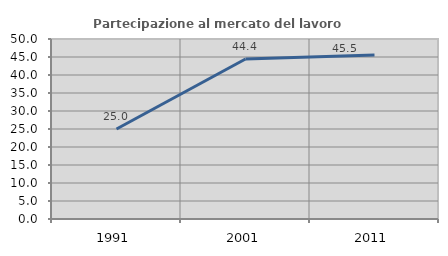
| Category | Partecipazione al mercato del lavoro  femminile |
|---|---|
| 1991.0 | 25 |
| 2001.0 | 44.444 |
| 2011.0 | 45.55 |